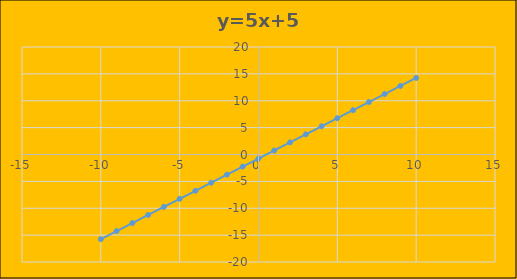
| Category | Series 0 |
|---|---|
| -10.0 | -15.75 |
| -9.0 | -14.25 |
| -8.0 | -12.75 |
| -7.0 | -11.25 |
| -6.0 | -9.75 |
| -5.0 | -8.25 |
| -4.0 | -6.75 |
| -3.0 | -5.25 |
| -2.0 | -3.75 |
| -1.0 | -2.25 |
| 0.0 | -0.75 |
| 1.0 | 0.75 |
| 2.0 | 2.25 |
| 3.0 | 3.75 |
| 4.0 | 5.25 |
| 5.0 | 6.75 |
| 6.0 | 8.25 |
| 7.0 | 9.75 |
| 8.0 | 11.25 |
| 9.0 | 12.75 |
| 10.0 | 14.25 |